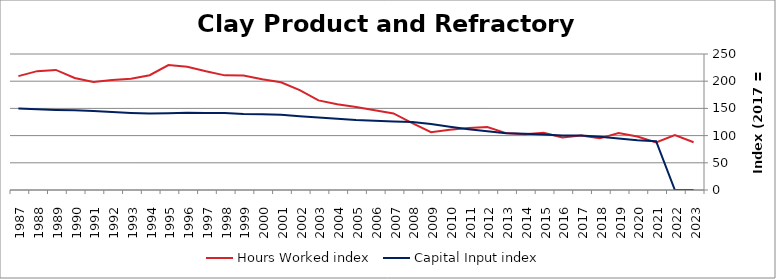
| Category | Hours Worked index | Capital Input index |
|---|---|---|
| 2023.0 | 87.788 | 0 |
| 2022.0 | 100.782 | 0 |
| 2021.0 | 87.272 | 89.665 |
| 2020.0 | 98.365 | 91.533 |
| 2019.0 | 104.712 | 94.568 |
| 2018.0 | 94.943 | 97.847 |
| 2017.0 | 100 | 100 |
| 2016.0 | 96.472 | 100.243 |
| 2015.0 | 105.06 | 101.929 |
| 2014.0 | 102.609 | 103.207 |
| 2013.0 | 104.632 | 104.522 |
| 2012.0 | 115.629 | 107.834 |
| 2011.0 | 113.859 | 111.806 |
| 2010.0 | 110.869 | 116.213 |
| 2009.0 | 106.129 | 121.338 |
| 2008.0 | 122.927 | 125.085 |
| 2007.0 | 140.66 | 126.113 |
| 2006.0 | 146.401 | 127.388 |
| 2005.0 | 152.681 | 128.77 |
| 2004.0 | 157.581 | 131.002 |
| 2003.0 | 164.682 | 133.391 |
| 2002.0 | 183.533 | 135.717 |
| 2001.0 | 198.147 | 138.175 |
| 2000.0 | 203.723 | 139.202 |
| 1999.0 | 210.638 | 139.494 |
| 1998.0 | 210.736 | 141.603 |
| 1997.0 | 218.273 | 141.722 |
| 1996.0 | 226.689 | 142.057 |
| 1995.0 | 229.766 | 140.997 |
| 1994.0 | 210.997 | 140.575 |
| 1993.0 | 204.595 | 141.575 |
| 1992.0 | 202.317 | 143.287 |
| 1991.0 | 198.597 | 145.337 |
| 1990.0 | 206.023 | 146.439 |
| 1989.0 | 220.752 | 147.205 |
| 1988.0 | 218.488 | 148.28 |
| 1987.0 | 209.385 | 150.039 |